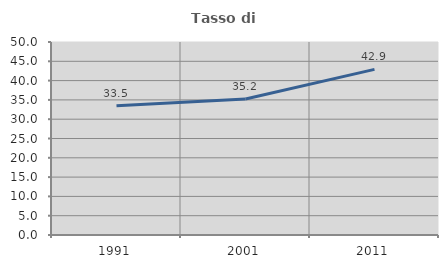
| Category | Tasso di occupazione   |
|---|---|
| 1991.0 | 33.499 |
| 2001.0 | 35.213 |
| 2011.0 | 42.917 |